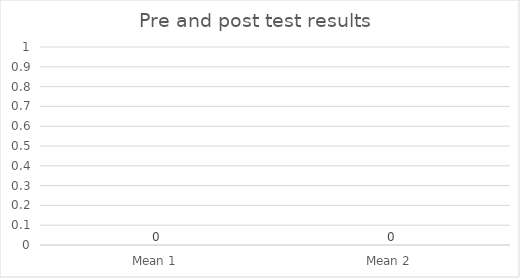
| Category | Series 0 |
|---|---|
| Mean 1  | 0 |
| Mean 2  | 0 |